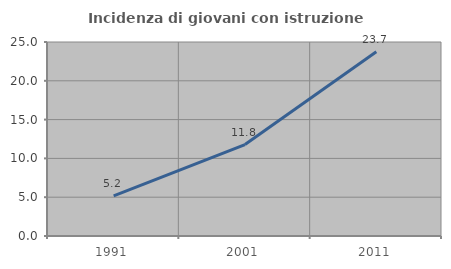
| Category | Incidenza di giovani con istruzione universitaria |
|---|---|
| 1991.0 | 5.181 |
| 2001.0 | 11.782 |
| 2011.0 | 23.744 |